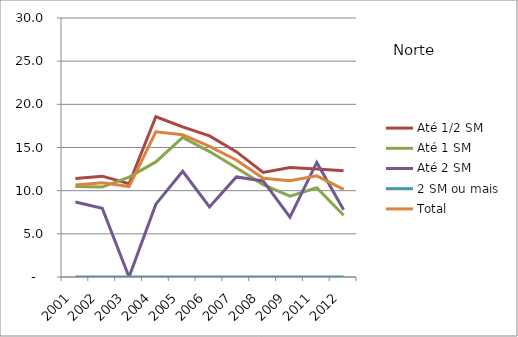
| Category | Até 1/2 SM | Até 1 SM | Até 2 SM | 2 SM ou mais | Total |
|---|---|---|---|---|---|
| 2001.0 | 11.41 | 10.49 | 8.69 | 0 | 10.65 |
| 2002.0 | 11.68 | 10.42 | 7.96 | 0 | 10.92 |
| 2003.0 | 10.8 | 11.57 | 0 | 0 | 10.47 |
| 2004.0 | 18.56 | 13.33 | 8.44 | 0 | 16.81 |
| 2005.0 | 17.38 | 16.17 | 12.25 | 0 | 16.48 |
| 2006.0 | 16.34 | 14.53 | 8.12 | 0 | 15.13 |
| 2007.0 | 14.52 | 12.65 | 11.59 | 0 | 13.55 |
| 2008.0 | 12.12 | 10.7 | 11.13 | 0 | 11.44 |
| 2009.0 | 12.68 | 9.36 | 6.94 | 0 | 11.15 |
| 2011.0 | 12.5 | 10.34 | 13.27 | 0 | 11.72 |
| 2012.0 | 12.3 | 7.16 | 7.79 | 0 | 10.16 |